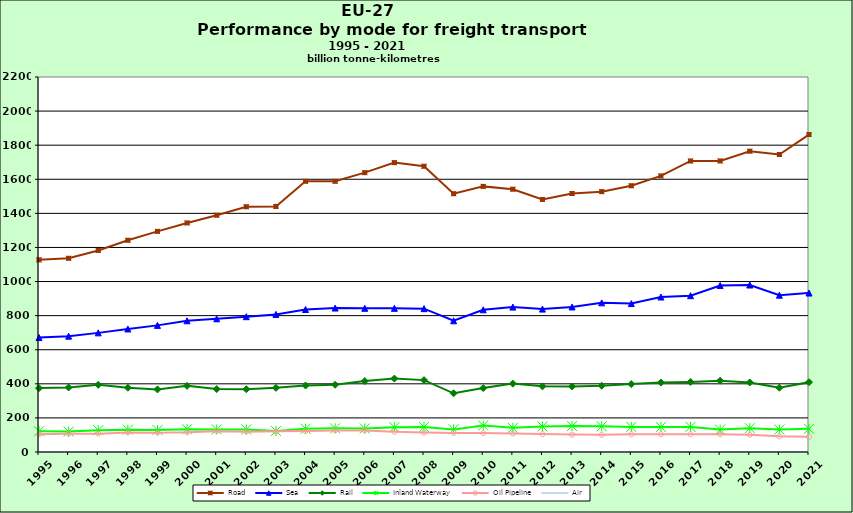
| Category | Road | Sea | Rail | Inland Waterway | Oil Pipeline | Air |
|---|---|---|---|---|---|---|
| 1995.0 | 1127.16 | 671.365 | 374.818 | 121.918 | 103.81 | 1.418 |
| 1996.0 | 1136.379 | 679.567 | 378.763 | 119.598 | 107.707 | 1.461 |
| 1997.0 | 1182.478 | 698.9 | 394.352 | 127.72 | 107.669 | 1.546 |
| 1998.0 | 1242.204 | 721.747 | 377.038 | 130.914 | 114.674 | 1.596 |
| 1999.0 | 1294.362 | 742.837 | 367.11 | 128.619 | 113.214 | 1.631 |
| 2000.0 | 1343.867 | 769.785 | 387.921 | 133.715 | 115.683 | 1.737 |
| 2001.0 | 1389.253 | 781.502 | 369.253 | 132.416 | 122.375 | 1.744 |
| 2002.0 | 1438.8 | 793.805 | 368.161 | 132.414 | 118.797 | 1.702 |
| 2003.0 | 1440.54 | 807.279 | 376.309 | 123.435 | 121.204 | 1.716 |
| 2004.0 | 1588.266 | 835.985 | 390.035 | 136.763 | 122.602 | 1.78 |
| 2005.0 | 1588.154 | 844.472 | 394.597 | 138.611 | 126.809 | 1.83 |
| 2006.0 | 1638.795 | 842.969 | 416.246 | 138.417 | 125.789 | 1.886 |
| 2007.0 | 1697.644 | 842.929 | 430.724 | 145.402 | 118.222 | 1.95 |
| 2008.0 | 1676.462 | 841.124 | 421.686 | 146.903 | 114.765 | 1.907 |
| 2009.0 | 1515.317 | 769.757 | 344.369 | 132.606 | 111.634 | 1.807 |
| 2010.0 | 1558.293 | 834.101 | 374.955 | 155.365 | 110.968 | 1.834 |
| 2011.0 | 1541.631 | 850.144 | 401.122 | 141.825 | 108.27 | 1.831 |
| 2012.0 | 1481.69 | 838.423 | 385.189 | 149.822 | 104.983 | 1.808 |
| 2013.0 | 1516.364 | 850.983 | 384.319 | 152.584 | 102.083 | 1.815 |
| 2014.0 | 1527.435 | 875.12 | 388.932 | 150.707 | 101.086 | 2.099 |
| 2015.0 | 1561.988 | 870.771 | 398.517 | 147.351 | 104.15 | 2.126 |
| 2016.0 | 1619.748 | 909.32 | 407.458 | 146.609 | 104.697 | 2.129 |
| 2017.0 | 1707.314 | 916.989 | 411.278 | 147.223 | 104.021 | 2.146 |
| 2018.0 | 1707.496 | 976.974 | 418.314 | 131.303 | 104.112 | 2.19 |
| 2019.0 | 1764.788 | 979.543 | 407.921 | 139.697 | 101.01 | 2.299 |
| 2020.0 | 1745.332 | 919.888 | 377.307 | 131.741 | 91.725 | 2.043 |
| 2021.0 | 1862.515 | 932.673 | 409.572 | 136.076 | 88.681 | 2.366 |